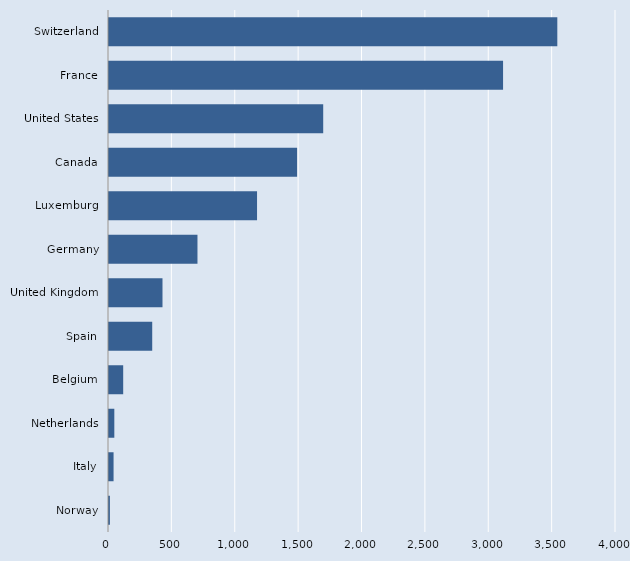
| Category | Series 0 |
|---|---|
| Norway | 7 |
| Italy | 36 |
| Netherlands | 42 |
| Belgium | 112 |
| Spain | 341 |
| United Kingdom | 422 |
| Germany | 698 |
| Luxemburg | 1168 |
| Canada | 1484 |
| United States | 1690 |
| France | 3109 |
| Switzerland | 3537 |